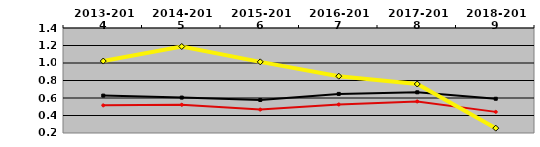
| Category | Series 3 |  WEST MEDIAN | NATIONAL MEDIAN | TEXAS LUTHERAN |
|---|---|---|---|---|
| 2013-2014 | 0.4 | 0.516 | 0.627 | 1.022 |
| 2014-2015 | 0.4 | 0.522 | 0.605 | 1.189 |
| 2015-2016 | 0.4 | 0.468 | 0.577 | 1.013 |
| 2016-2017 | 0.4 | 0.526 | 0.647 | 0.849 |
| 2017-2018 | 0.4 | 0.56 | 0.665 | 0.76 |
| 2018-2019 | 0.4 | 0.441 | 0.591 | 0.255 |